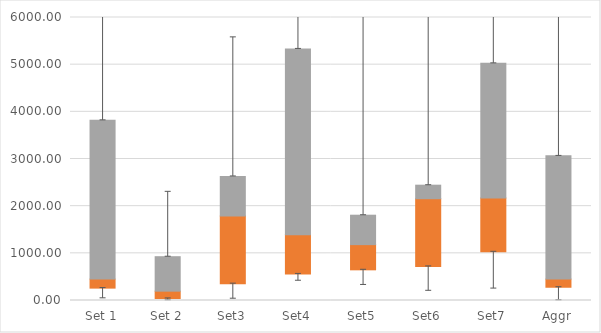
| Category | Q1 | Median-Q1 | Q3-Median |
|---|---|---|---|
| Set 1 | 262.42 | 191.104 | 3366.661 |
| Set 2 | 42.812 | 155.188 | 730.897 |
| Set3 | 356.171 | 1433.594 | 841.4 |
| Set4 | 562.294 | 833.717 | 3938.749 |
| Set5 | 650.241 | 534.246 | 623.809 |
| Set6 | 722.203 | 1435.93 | 286.826 |
| Set7 | 1031.295 | 1140.639 | 2856.763 |
| Aggr | 280.866 | 172.657 | 2613.06 |